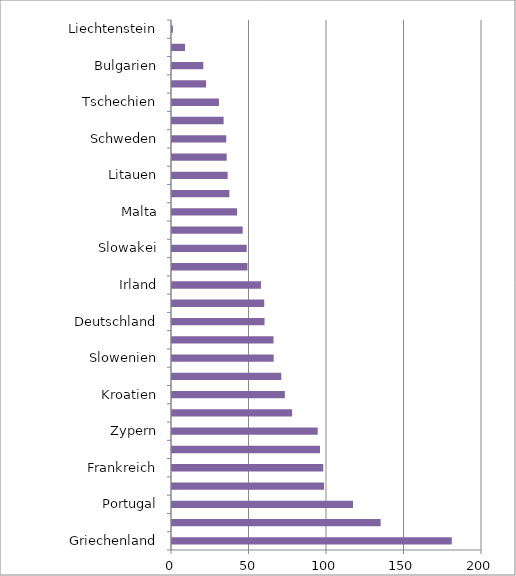
| Category | Series 0 |
|---|---|
| Griechenland | 180.5 |
| Italien | 134.6 |
| Portugal | 116.8 |
| Belgien | 98.1 |
| Frankreich | 97.6 |
| Spanien | 95.5 |
| Zypern | 94 |
| Europäische Union (27 Länder) | 77.5 |
| Kroatien | 72.8 |
| Österreich | 70.5 |
| Slowenien | 65.6 |
| Ungarn | 65.5 |
| Deutschland | 59.7 |
| Finnland | 59.5 |
| Irland | 57.4 |
| Niederlande | 48.7 |
| Slowakei | 48.2 |
| Polen | 45.6 |
| Malta | 42 |
| Lettland | 37 |
| Litauen | 35.9 |
| Rumänien | 35.3 |
| Schweden | 35 |
| Dänemark | 33.3 |
| Tschechien | 30.3 |
| Luxemburg | 22 |
| Bulgarien | 20.2 |
| Estland | 8.4 |
| Liechtenstein | 0.6 |